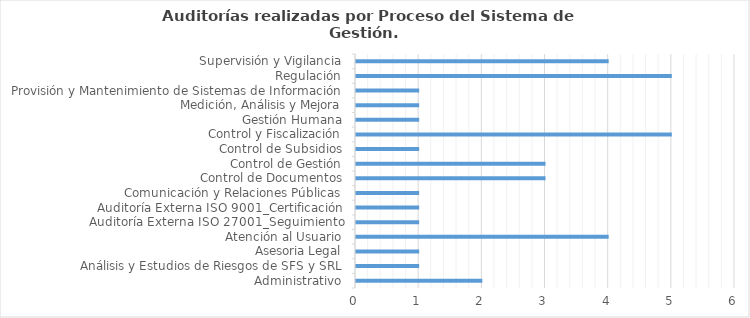
| Category | Total |
|---|---|
| Administrativo | 2 |
| Análisis y Estudios de Riesgos de SFS y SRL | 1 |
| Asesoria Legal | 1 |
| Atención al Usuario | 4 |
| Auditoría Externa ISO 27001_Seguimiento | 1 |
| Auditoría Externa ISO 9001_Certificación | 1 |
| Comunicación y Relaciones Públicas | 1 |
| Control de Documentos | 3 |
| Control de Gestión | 3 |
| Control de Subsidios | 1 |
| Control y Fiscalización | 5 |
| Gestión Humana | 1 |
| Medición, Análisis y Mejora | 1 |
| Provisión y Mantenimiento de Sistemas de Información | 1 |
| Regulación | 5 |
| Supervisión y Vigilancia | 4 |